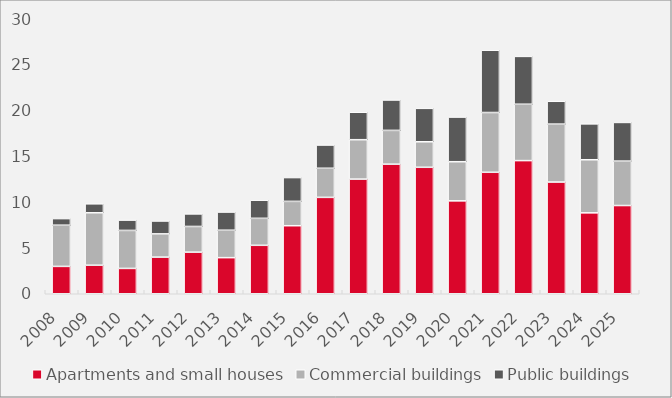
| Category | Apartments and small houses | Commercial buildings | Public buildings |
|---|---|---|---|
| 2008.0 | 2.986 | 4.492 | 0.721 |
| 2009.0 | 3.114 | 5.718 | 0.981 |
| 2010.0 | 2.763 | 4.146 | 1.125 |
| 2011.0 | 3.996 | 2.537 | 1.404 |
| 2012.0 | 4.539 | 2.802 | 1.37 |
| 2013.0 | 3.938 | 2.994 | 1.981 |
| 2014.0 | 5.285 | 2.943 | 1.978 |
| 2015.0 | 7.423 | 2.655 | 2.596 |
| 2016.0 | 10.515 | 3.176 | 2.534 |
| 2017.0 | 12.507 | 4.299 | 2.994 |
| 2018.0 | 14.136 | 3.685 | 3.316 |
| 2019.0 | 13.796 | 2.783 | 3.648 |
| 2020.0 | 10.133 | 4.271 | 4.872 |
| 2021.0 | 13.252 | 6.519 | 6.796 |
| 2022.0 | 14.525 | 6.151 | 5.218 |
| 2023.0 | 12.186 | 6.321 | 2.49 |
| 2024.0 | 8.826 | 5.793 | 3.914 |
| 2025.0 | 9.625 | 4.846 | 4.218 |